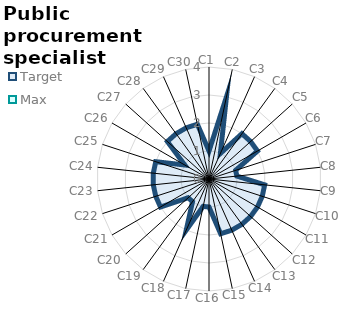
| Category | Target | Max |
|---|---|---|
| C1 | 1 | 0 |
| C2 | 3 | 0 |
| C3 | 1 | 0 |
| C4 | 2 | 0 |
| C5 | 2 | 0 |
| C6 | 2 | 0 |
| C7 | 1 | 0 |
| C8 | 1 | 0 |
| C9 | 2 | 0 |
| C10 | 2 | 0 |
| C11 | 2 | 0 |
| C12 | 2 | 0 |
| C13 | 2 | 0 |
| C14 | 2 | 0 |
| C15 | 2 | 0 |
| C16 | 1 | 0 |
| C17 | 1 | 0 |
| C18 | 2 | 0 |
| C19 | 1 | 0 |
| C20 | 1 | 0 |
| C21 | 2 | 0 |
| C22 | 2 | 0 |
| C23 | 2 | 0 |
| C24 | 2 | 0 |
| C25 | 2 | 0 |
| C26 | 1 | 0 |
| C27 | 2 | 0 |
| C28 | 2 | 0 |
| C29 | 2 | 0 |
| C30 | 2 | 0 |